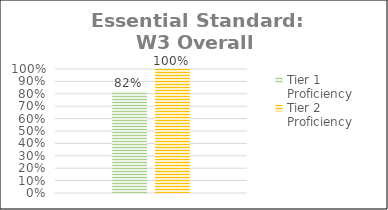
| Category | Tier 1 Proficiency | Tier 2 Proficiency |
|---|---|---|
| 0 | 0.82 | 1 |